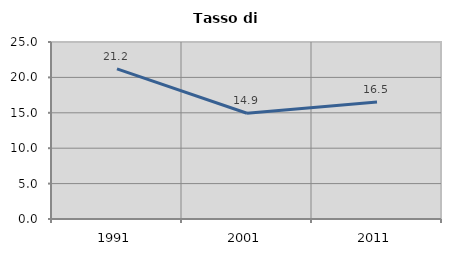
| Category | Tasso di disoccupazione   |
|---|---|
| 1991.0 | 21.215 |
| 2001.0 | 14.94 |
| 2011.0 | 16.526 |